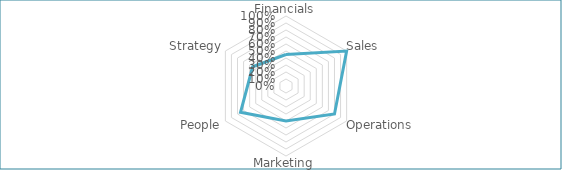
| Category | Series 0 |
|---|---|
| Financials | 0.45 |
| Sales | 1 |
| Operations  | 0.8 |
| Marketing | 0.5 |
| People | 0.75 |
| Strategy | 0.55 |